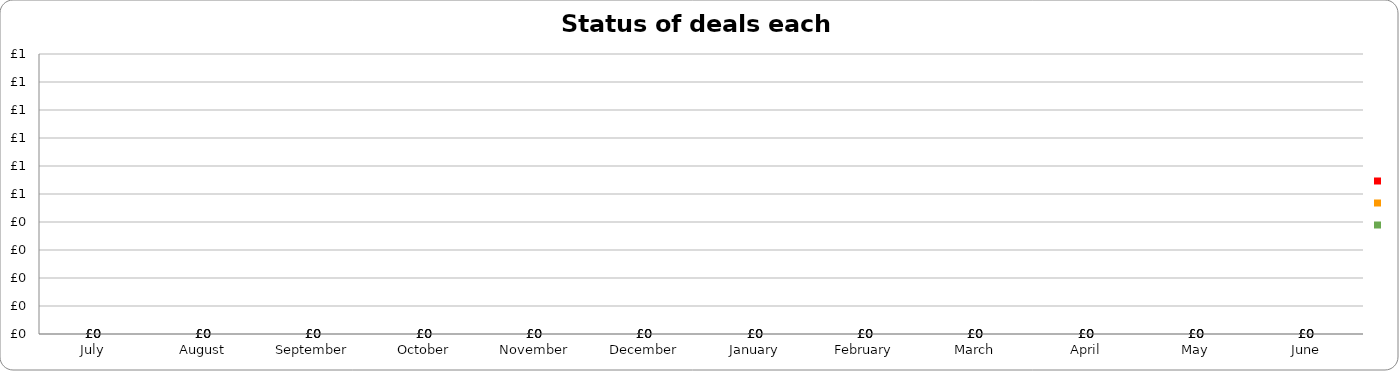
| Category | Series 0 | Series 1 | Series 2 |
|---|---|---|---|
| 2019-07-01 | 0 | 0 | 0 |
| 2019-08-01 | 0 | 0 | 0 |
| 2019-09-01 | 0 | 0 | 0 |
| 2019-10-01 | 0 | 0 | 0 |
| 2019-11-01 | 0 | 0 | 0 |
| 2019-12-01 | 0 | 0 | 0 |
| 2020-01-01 | 0 | 0 | 0 |
| 2020-02-01 | 0 | 0 | 0 |
| 2020-03-01 | 0 | 0 | 0 |
| 2020-04-01 | 0 | 0 | 0 |
| 2020-05-01 | 0 | 0 | 0 |
| 2020-06-01 | 0 | 0 | 0 |